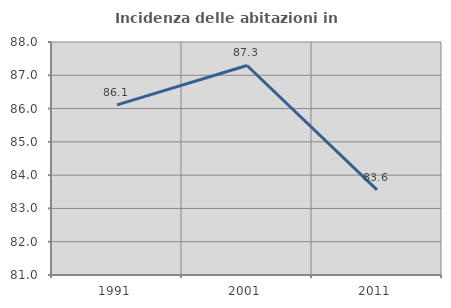
| Category | Incidenza delle abitazioni in proprietà  |
|---|---|
| 1991.0 | 86.111 |
| 2001.0 | 87.295 |
| 2011.0 | 83.556 |